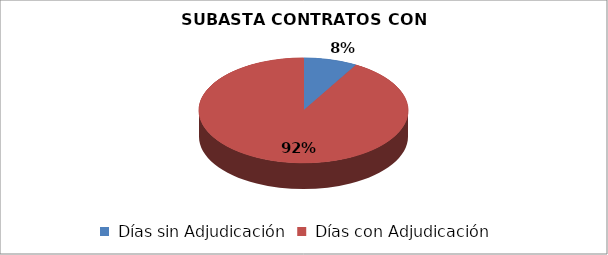
| Category | Series 0 |
|---|---|
| Días sin Adjudicación | 1 |
| Días con Adjudicación  | 11 |